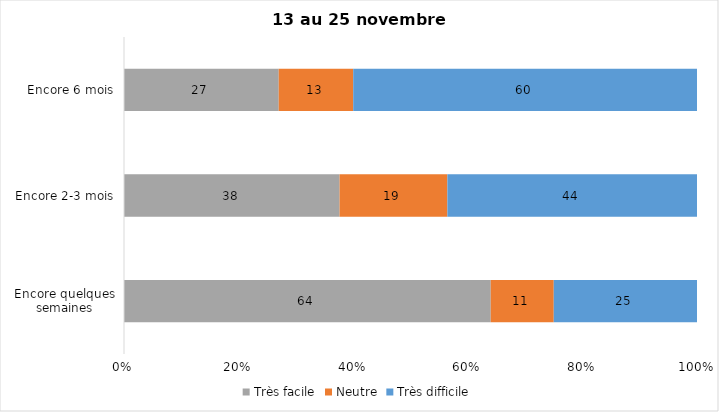
| Category | Très facile | Neutre | Très difficile |
|---|---|---|---|
| Encore quelques semaines | 64 | 11 | 25 |
| Encore 2-3 mois | 38 | 19 | 44 |
| Encore 6 mois | 27 | 13 | 60 |